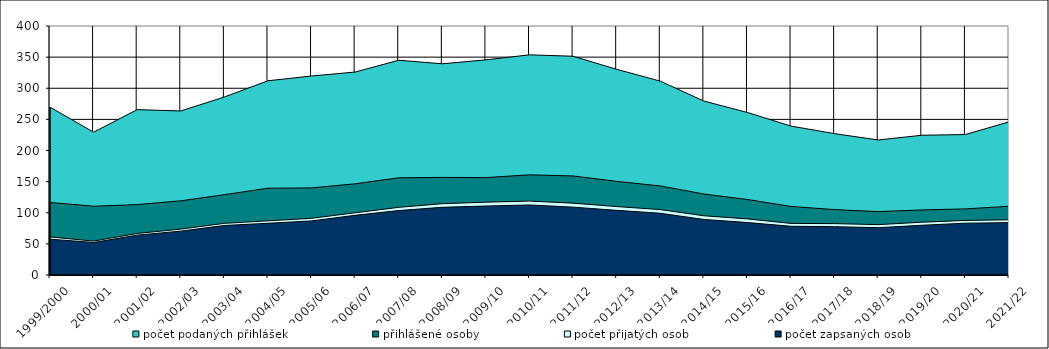
| Category | počet podaných přihlášek | přihlášené osoby | počet přijatých osob | počet zapsaných osob |
|---|---|---|---|---|
| 1999/2000 | 269.7 | 116.6 | 61.2 | 57.6 |
| 2000/01 | 229.393 | 110.486 | 54.456 | 52.248 |
| 2001/02 | 265.663 | 113.14 | 66.698 | 64.001 |
| 2002/03 | 263.476 | 119.13 | 73.7 | 70.464 |
| 2003/04 | 285.946 | 129 | 82.968 | 79.524 |
| 2004/05 | 312 | 139.4 | 87 | 83.1 |
| 2005/06 | 319.7 | 139.9 | 91.1 | 86.9 |
| 2006/07 | 326 | 146.5 | 99.9 | 95.9 |
| 2007/08 | 345 | 156.1 | 108.7 | 103.5 |
| 2008/09 | 339.262 | 156.798 | 114.539 | 108.783 |
| 2009/10 | 345.616 | 156.438 | 117.014 | 110.776 |
| 2010/11 | 353.682 | 160.953 | 118.728 | 112.52 |
| 2011/12 | 351.424 | 159.1 | 115.404 | 109.033 |
| 2012/13 | 330.443 | 150.411 | 109.919 | 103.822 |
| 2013/14 | 311.426 | 143.019 | 105.074 | 99.145 |
| 2014/15 | 279.423 | 130.09 | 95.146 | 89.229 |
| 2015/16 | 261.103 | 121.269 | 90.138 | 84.278 |
| 2016/17 | 239.187 | 110.163 | 82.862 | 78.257 |
| 2017/18 | 227.06 | 105.039 | 82.539 | 77.587 |
| 2018/19 | 216.903 | 101.834 | 80.91 | 76.012 |
| 2019/20 | 224.496 | 104.521 | 84.782 | 79.919 |
| 2020/21 | 225.646 | 106.209 | 87.637 | 83.222 |
| 2021/22 | 245.99 | 110.482 | 88.751 | 84.092 |